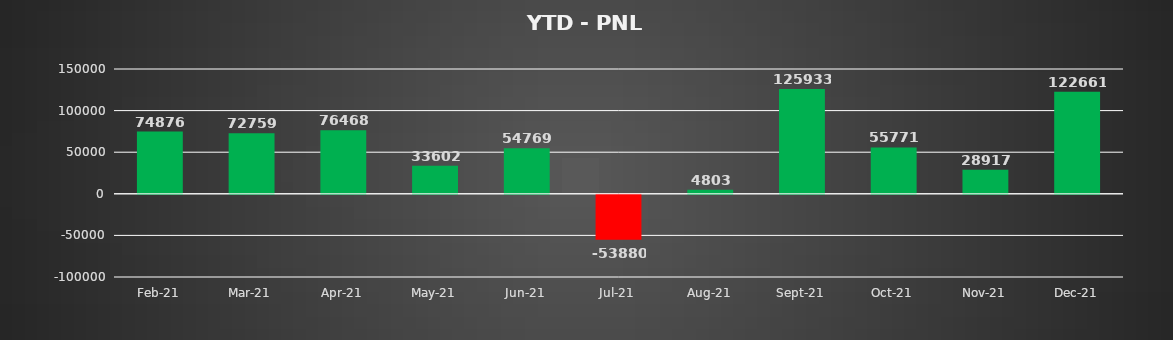
| Category | Series 1 |
|---|---|
| 2021-02-01 | 74876.08 |
| 2021-03-01 | 72759.269 |
| 2021-04-01 | 76468.4 |
| 2021-05-01 | 33601.677 |
| 2021-06-01 | 54768.837 |
| 2021-07-01 | -53880.349 |
| 2021-08-01 | 4802.697 |
| 2021-09-01 | 125933.181 |
| 2021-10-01 | 55770.727 |
| 2021-11-01 | 28917.5 |
| 2021-12-01 | 122660.973 |